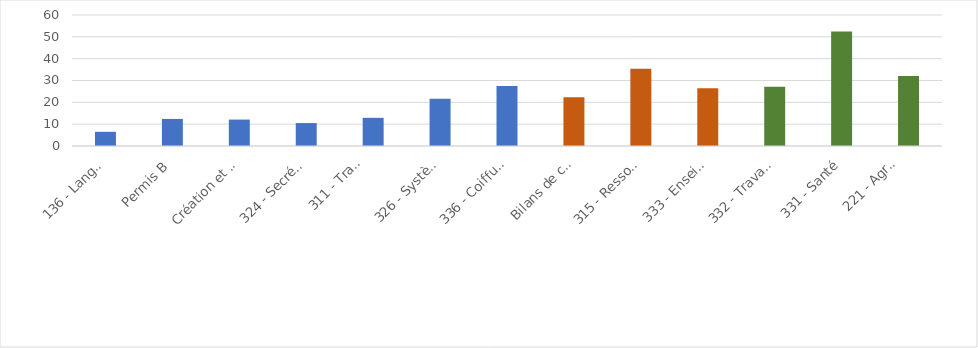
| Category | Concentration de la consommation de formations en 2021 |
|---|---|
| 136 - Langues vivantes | 6.5 |
| Permis B | 12.4 |
| Création et reprise d'entreprise | 12.1 |
| 324 - Secrétariat, bureautique | 10.5 |
| 311 - Transport (hors permis B),
manutention, magasinage | 12.9 |
| 326 - Systèmes d'information | 21.6 |
| 336 - Coiffure, esthétique | 27.5 |
| Bilans de compétences | 22.3 |
| 315 - Ressources humaines | 35.4 |
| 333 - Enseignement, formation | 26.4 |
| 332 - Travail social | 27.1 |
| 331 - Santé | 52.5 |
| 221 - Agroalimentaire,
alimentation, cuisine | 32.1 |